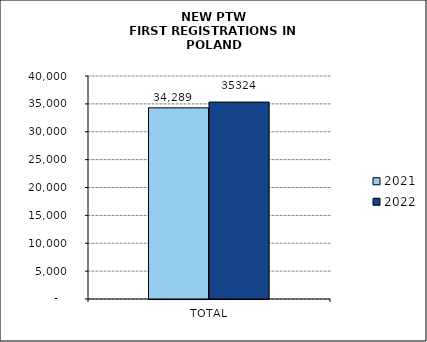
| Category | 2021 | 2022 |
|---|---|---|
| TOTAL | 34289 | 35324 |